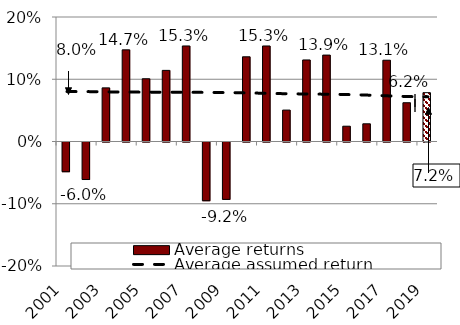
| Category | Average returns |
|---|---|
| 0 | -0.048 |
| 1 | -0.06 |
| 2 | 0.086 |
| 3 | 0.147 |
| 4 | 0.101 |
| 5 | 0.114 |
| 6 | 0.153 |
| 7 | -0.094 |
| 8 | -0.092 |
| 9 | 0.136 |
| 10 | 0.153 |
| 11 | 0.05 |
| 12 | 0.131 |
| 13 | 0.139 |
| 14 | 0.025 |
| 15 | 0.028 |
| 16 | 0.131 |
| 17 | 0.062 |
| 18 | 0.078 |